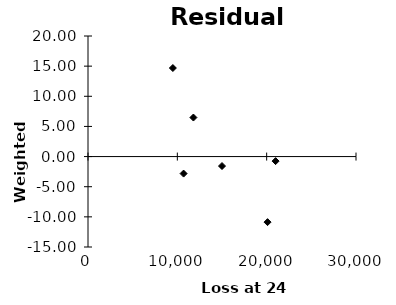
| Category | Series 0 |
|---|---|
| 10700.0 | -2.821 |
| 9500.0 | 14.687 |
| 15000.0 | -1.57 |
| 20100.0 | -10.874 |
| 21000.0 | -0.754 |
| 11800.0 | 6.475 |